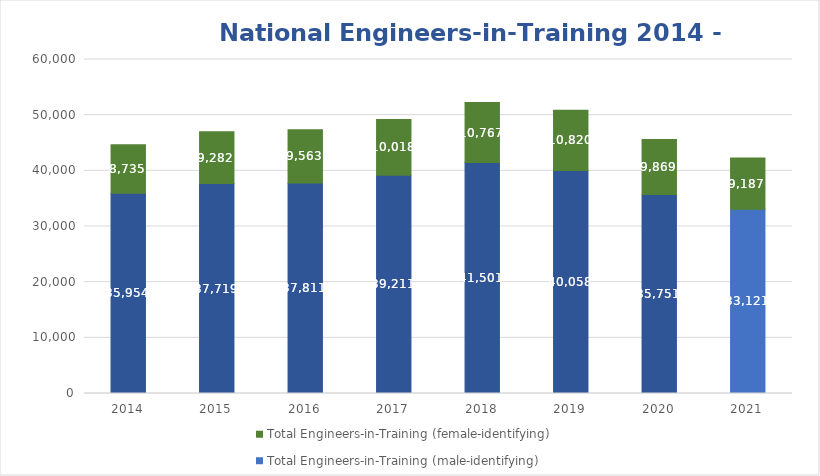
| Category | Total Engineers-in-Training (male-identifying) | Total Engineers-in-Training (female-identifying) |
|---|---|---|
| 2014.0 | 35954 | 8735 |
| 2015.0 | 37719 | 9282 |
| 2016.0 | 37811 | 9563 |
| 2017.0 | 39211 | 10018 |
| 2018.0 | 41501 | 10767 |
| 2019.0 | 40058 | 10820 |
| 2020.0 | 35751 | 9869 |
| 2021.0 | 33121 | 9187 |